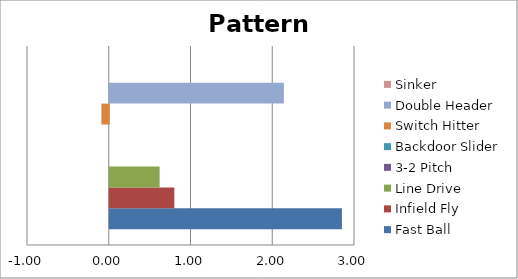
| Category | Fast Ball | Infield Fly | Line Drive | 3-2 Pitch | Backdoor Slider | Switch Hitter | Double Header | Sinker |
|---|---|---|---|---|---|---|---|---|
| 0 | 2.84 | 0.79 | 0.61 | 0 | 0 | -0.09 | 2.13 | 0 |